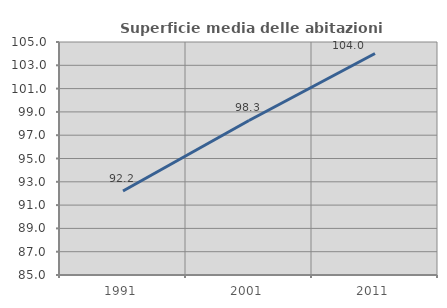
| Category | Superficie media delle abitazioni occupate |
|---|---|
| 1991.0 | 92.206 |
| 2001.0 | 98.262 |
| 2011.0 | 104.013 |